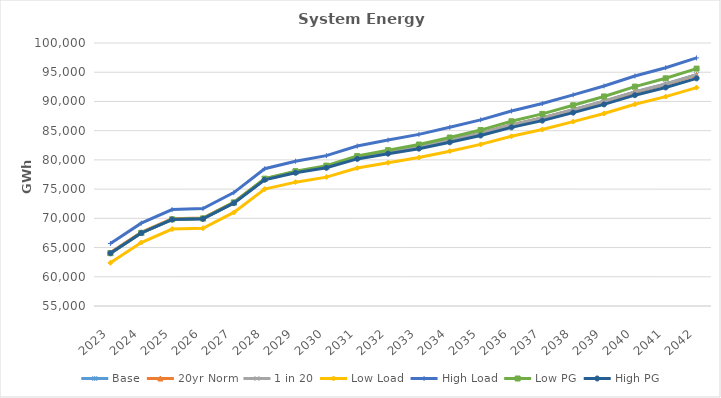
| Category | Base | 20yr Norm | 1 in 20 | Low Load | High Load | Low PG | High PG |
|---|---|---|---|---|---|---|---|
| 2023.0 | 64032.93 | 64141.836 | 64032.942 | 62392.818 | 65693.12 | 64037.84 | 64030.863 |
| 2024.0 | 67499.266 | 67607.447 | 67499.236 | 65857.147 | 69179.939 | 67514.449 | 67491.852 |
| 2025.0 | 69805.06 | 69911.772 | 69805.058 | 68170.499 | 71500.328 | 69833.834 | 69789.607 |
| 2026.0 | 69938.418 | 70037.565 | 69938.414 | 68307.222 | 71661.948 | 69987.672 | 69909.583 |
| 2027.0 | 72649.77 | 72741.172 | 72649.766 | 71004.851 | 74408.403 | 72726.444 | 72599.538 |
| 2028.0 | 76681.13 | 76764.966 | 76681.146 | 74997.578 | 78485.963 | 76791.892 | 76598.925 |
| 2029.0 | 77919.276 | 77994.291 | 77919.262 | 76191.539 | 79768.077 | 78070.811 | 77797.162 |
| 2030.0 | 78811.837 | 78877.928 | 78811.824 | 77051.132 | 80723.765 | 79018.709 | 78646.352 |
| 2031.0 | 80380.694 | 80437.643 | 80380.694 | 78597.167 | 82367.049 | 80653.738 | 80169.688 |
| 2032.0 | 81321.783 | 81369.845 | 81321.783 | 79514.341 | 83390.424 | 81663.875 | 81064.687 |
| 2033.0 | 82222.228 | 82259.806 | 82222.233 | 80397.611 | 84364.92 | 82634.214 | 81920.911 |
| 2034.0 | 83351.536 | 83378.718 | 83351.554 | 81491.261 | 85571.565 | 83832.656 | 83009.801 |
| 2035.0 | 84549.966 | 84566.149 | 84549.954 | 82650.477 | 86849.373 | 85101.85 | 84169.354 |
| 2036.0 | 85984.862 | 85986.903 | 85984.851 | 84035.392 | 88368.67 | 86606.826 | 85565.538 |
| 2037.0 | 87179.752 | 87165.525 | 87179.754 | 85188.91 | 89639.256 | 87871.098 | 86721.937 |
| 2038.0 | 88585.256 | 88555.115 | 88585.258 | 86548.542 | 91124.326 | 89345.262 | 88089.208 |
| 2039.0 | 90027.164 | 89980.646 | 90027.17 | 87944.235 | 92645.484 | 90855.151 | 89493.147 |
| 2040.0 | 91644.105 | 91581.73 | 91644.113 | 89510.348 | 94345.999 | 92539.55 | 91072.428 |
| 2041.0 | 92996.551 | 92916.114 | 92996.535 | 90821.303 | 95772.939 | 93959.094 | 92387.525 |
| 2042.0 | 94591.13 | 94493.092 | 94591.133 | 92370.324 | 97446.699 | 95620.588 | 93945.006 |